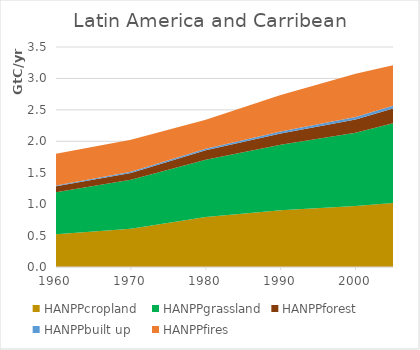
| Category | HANPPcropland | HANPPgrassland | HANPPforest | HANPPbuilt up | HANPPfires |
|---|---|---|---|---|---|
| 1960.0 | 519115.216 | 669136.209 | 97515.563 | 12263.211 | 503034.254 |
| 1970.0 | 609971.038 | 777006.401 | 110134.663 | 17847.54 | 510095.092 |
| 1980.0 | 796194.401 | 911147.916 | 149347.62 | 23606.451 | 460447.666 |
| 1990.0 | 904367.079 | 1039673.667 | 180014.305 | 30831.734 | 583195.959 |
| 2000.0 | 970517.835 | 1164351.864 | 211484.855 | 39913.981 | 689158.272 |
| 2005.0 | 1017328.256 | 1268659.402 | 234347.243 | 43344.849 | 647618.471 |